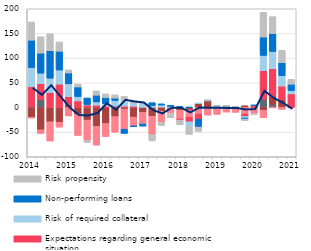
| Category | Other factors | Costs of funding | Competition from other banks | Expectations regarding general economic situation | Risk of required collateral  | Non-performing loans  | Risk propensity |
|---|---|---|---|---|---|---|---|
| 2014.0 | 0.8 | -19.9 | -1.7 | 41 | 39.1 | 55.5 | 36.9 |
| nan | 16.1 | -45.3 | -7.7 | 31.9 | 21.4 | 40.8 | 33.2 |
| nan | 0 | -29 | -39.1 | 30.4 | 28.9 | 55.7 | 34.4 |
| nan | 0 | -30.3 | -9.6 | 47.3 | 28.6 | 38.1 | 18.7 |
| 2015.0 | 0 | 5.3 | -17.2 | 16.4 | 26.1 | 22.1 | 6.2 |
| nan | 0 | -14.5 | -42.3 | 13.3 | 8.7 | 19.6 | 6 |
| nan | -0.9 | -24.7 | -41.2 | 5.2 | 0.6 | 13.5 | -4.1 |
| nan | 0.5 | -38.1 | -38.3 | 4.2 | 6.5 | 13.7 | 8.7 |
| 2016.0 | 0 | -32.5 | -26.6 | 2.8 | 4.8 | 12.6 | 7.3 |
| nan | 0 | -18.6 | -31.7 | 2.8 | 11.4 | 4.8 | 6.6 |
| nan | 0 | -3.2 | -40.9 | 2.6 | 11.7 | -8.5 | 8 |
| nan | 0 | -19.7 | -17.5 | 2.6 | 6.4 | -2 | 5.6 |
| 2017.0 | 0 | -9.9 | -23.6 | 0.3 | 6.6 | -4.3 | 1.9 |
| nan | 0 | -17.9 | -37.2 | 0.4 | 3.4 | 5.9 | -12.7 |
| nan | 0 | -7.4 | -22.4 | 0.6 | 4.3 | 2.5 | -6.8 |
| nan | 0 | -2.2 | -9.3 | 0.1 | 2.2 | 2.2 | -9.5 |
| 2018.0 | 0 | -5.5 | -17.5 | -2.5 | 0 | 1.9 | -9.6 |
| nan | 0 | -5.2 | -14.4 | -9.5 | -9.1 | 0.3 | -16.5 |
| nan | 0 | 8.2 | -13.3 | -10.8 | 0.3 | -15.6 | -8.9 |
| nan | 0 | 13.5 | -15.5 | 0.1 | 0.3 | 0.3 | 0.1 |
| 2019.0 | 0 | 0 | -14 | 0.1 | 2.4 | 0.3 | 0.1 |
| nan | 0 | 2.3 | -9.4 | 0.1 | 0.3 | 0.3 | 0.1 |
| nan | 0 | 0 | -9.9 | 0.1 | 0.4 | 0.4 | 0.1 |
| nan | 0 | 3.5 | -13.7 | -4.4 | -3.2 | -2.2 | -3.4 |
| 2020.0 | 0 | 0 | -11.9 | 3.7 | 0.4 | 0.4 | -2.6 |
| nan | 16.6 | -5.6 | -15.1 | 57.7 | 31.2 | 37.3 | 50 |
| nan | 6.7 | 15.9 | -0.1 | 55.9 | 35 | 36.1 | 34.5 |
| nan | 0 | 16.2 | -4 | 27.2 | 21.1 | 26.4 | 24.9 |
| 2021.0 | 0 | 0 | -0.2 | 27.5 | 6.7 | 12.9 | 10 |